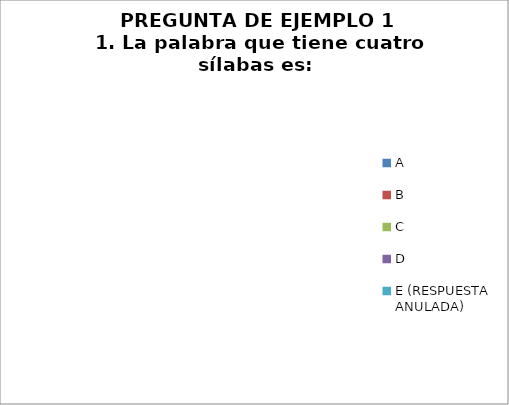
| Category | CANTIDAD DE RESPUESTAS PREGUNTA (1) | PORCENTAJE |
|---|---|---|
| A | 0 | 0 |
| B | 0 | 0 |
| C | 0 | 0 |
| D | 0 | 0 |
| E (RESPUESTA ANULADA) | 0 | 0 |